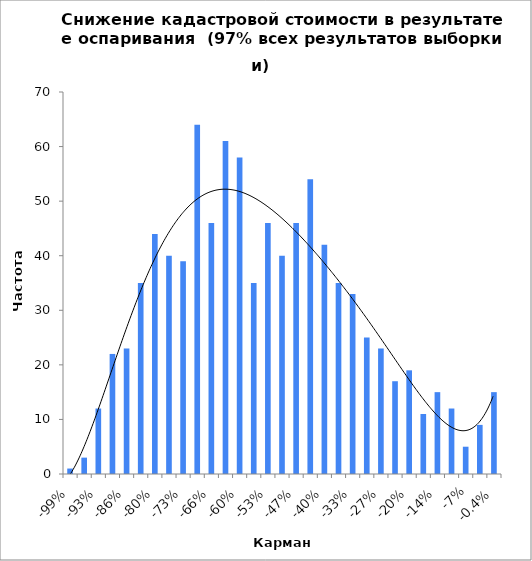
| Category | Частота |
|---|---|
| -0.9941932740946304 | 1 |
| -0.9611766635089175 | 3 |
| -0.9281600529232046 | 12 |
| -0.8951434423374917 | 22 |
| -0.8621268317517787 | 23 |
| -0.8291102211660658 | 35 |
| -0.7960936105803529 | 44 |
| -0.76307699999464 | 40 |
| -0.730060389408927 | 39 |
| -0.6970437788232141 | 64 |
| -0.6640271682375012 | 46 |
| -0.6310105576517883 | 61 |
| -0.5979939470660753 | 58 |
| -0.5649773364803624 | 35 |
| -0.5319607258946495 | 46 |
| -0.49894411530893656 | 40 |
| -0.46592750472322364 | 46 |
| -0.4329108941375107 | 54 |
| -0.3998942835517978 | 42 |
| -0.36687767296608487 | 35 |
| -0.33386106238037194 | 33 |
| -0.300844451794659 | 25 |
| -0.2678278412089461 | 23 |
| -0.23481123062323317 | 17 |
| -0.20179462003752024 | 19 |
| -0.16877800945180732 | 11 |
| -0.1357613988660944 | 15 |
| -0.10274478828038147 | 12 |
| -0.06972817769466855 | 5 |
| -0.03671156710895562 | 9 |
| -0.004 | 15 |